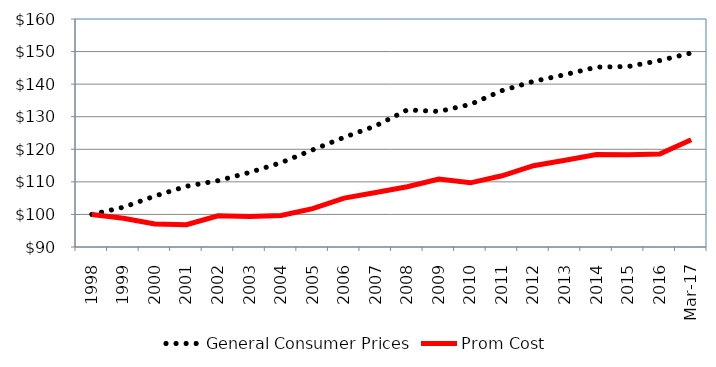
| Category | General Consumer Prices | Prom Cost |
|---|---|---|
| 1998.0 | 100 | 100 |
| 1999.0 | 102.209 | 98.798 |
| 2000.0 | 105.644 | 97.09 |
| 2001.0 | 108.65 | 96.855 |
| 2002.0 | 110.368 | 99.57 |
| 2003.0 | 112.883 | 99.389 |
| 2004.0 | 115.89 | 99.688 |
| 2005.0 | 119.816 | 101.798 |
| 2006.0 | 123.681 | 105.011 |
| 2007.0 | 127.204 | 106.731 |
| 2008.0 | 132.088 | 108.518 |
| 2009.0 | 131.618 | 110.846 |
| 2010.0 | 133.777 | 109.705 |
| 2011.0 | 137.999 | 111.862 |
| 2012.0 | 140.855 | 114.969 |
| 2013.0 | 142.918 | 116.639 |
| 2014.0 | 145.237 | 118.378 |
| 2015.0 | 145.409 | 118.289 |
| 2016.0 | 147.244 | 118.527 |
| 42795.0 | 149.571 | 122.957 |